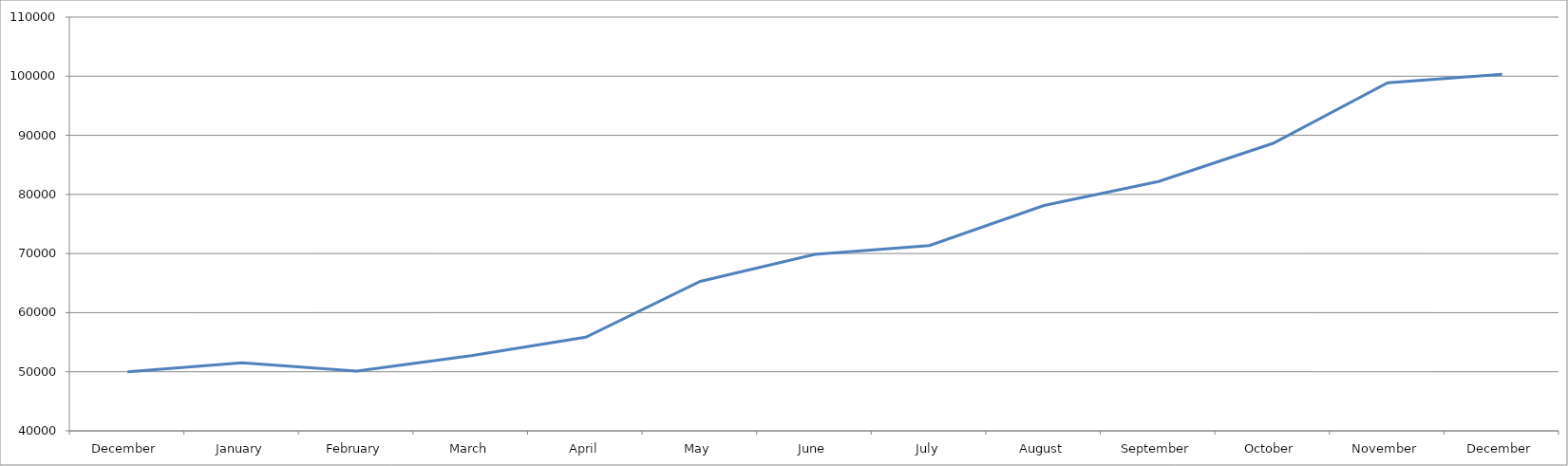
| Category | Series 0 |
|---|---|
| December | 50000 |
| January | 51524.831 |
| February | 50130.034 |
| March | 52716.407 |
| April | 55841.327 |
| May | 65287.682 |
| June | 69873.457 |
| July | 71364.353 |
| August | 78135.818 |
| September | 82190.593 |
| October | 88639.79 |
| November | 98888.086 |
| December | 100340.665 |